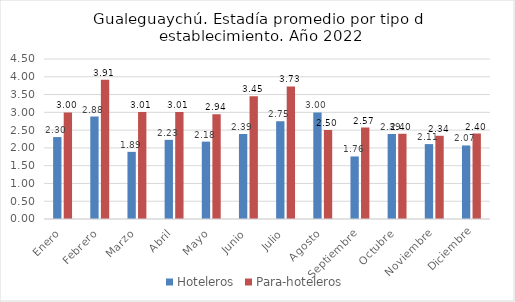
| Category | Hoteleros | Para-hoteleros |
|---|---|---|
| Enero | 2.304 | 2.998 |
| Febrero | 2.881 | 3.914 |
| Marzo | 1.888 | 3.008 |
| Abril | 2.227 | 3.007 |
| Mayo | 2.176 | 2.944 |
| Junio | 2.394 | 3.449 |
| Julio | 2.752 | 3.73 |
| Agosto | 2.998 | 2.503 |
| Septiembre | 1.759 | 2.571 |
| Octubre | 2.392 | 2.397 |
| Noviembre | 2.106 | 2.34 |
| Diciembre | 2.068 | 2.404 |